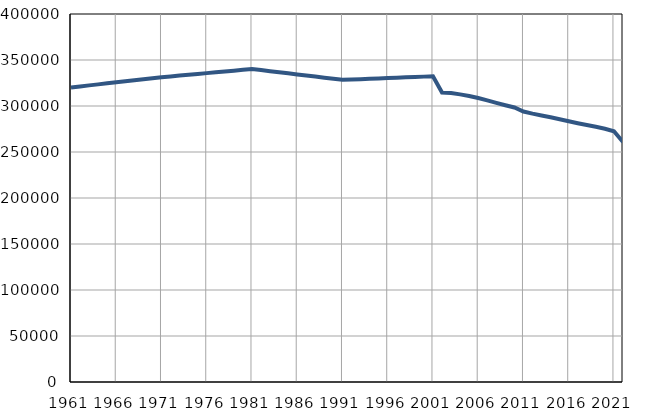
| Category | Број
становника |
|---|---|
| 1961.0 | 320187 |
| 1962.0 | 321297 |
| 1963.0 | 322407 |
| 1964.0 | 323516 |
| 1965.0 | 324626 |
| 1966.0 | 325736 |
| 1967.0 | 326846 |
| 1968.0 | 327956 |
| 1969.0 | 329065 |
| 1970.0 | 330175 |
| 1971.0 | 331285 |
| 1972.0 | 332175 |
| 1973.0 | 333066 |
| 1974.0 | 333956 |
| 1975.0 | 334847 |
| 1976.0 | 335737 |
| 1977.0 | 336627 |
| 1978.0 | 337518 |
| 1979.0 | 338408 |
| 1980.0 | 339299 |
| 1981.0 | 340189 |
| 1982.0 | 339013 |
| 1983.0 | 337837 |
| 1984.0 | 336661 |
| 1985.0 | 335485 |
| 1986.0 | 334309 |
| 1987.0 | 333132 |
| 1988.0 | 331956 |
| 1989.0 | 330780 |
| 1990.0 | 329604 |
| 1991.0 | 328428 |
| 1992.0 | 328817 |
| 1993.0 | 329206 |
| 1994.0 | 329595 |
| 1995.0 | 329984 |
| 1996.0 | 330373 |
| 1997.0 | 330761 |
| 1998.0 | 331150 |
| 1999.0 | 331539 |
| 2000.0 | 331928 |
| 2001.0 | 332317 |
| 2002.0 | 314658 |
| 2003.0 | 314082 |
| 2004.0 | 312621 |
| 2005.0 | 310862 |
| 2006.0 | 308706 |
| 2007.0 | 306133 |
| 2008.0 | 303392 |
| 2009.0 | 300874 |
| 2010.0 | 298400 |
| 2011.0 | 294043 |
| 2012.0 | 291686 |
| 2013.0 | 289766 |
| 2014.0 | 287739 |
| 2015.0 | 285597 |
| 2016.0 | 283350 |
| 2017.0 | 281203 |
| 2018.0 | 279281 |
| 2019.0 | 277393 |
| 2020.0 | 275289 |
| 2021.0 | 272560 |
| 2022.0 | 260906 |